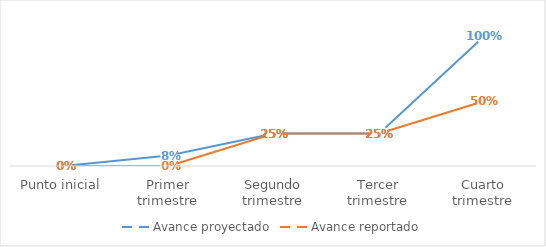
| Category | Avance proyectado | Avance reportado |
|---|---|---|
| Punto inicial | 0 | 0 |
| Primer trimestre | 0.08 | 0 |
| Segundo trimestre | 0.25 | 0.25 |
| Tercer trimestre | 0.25 | 0.25 |
| Cuarto trimestre | 1 | 0.5 |